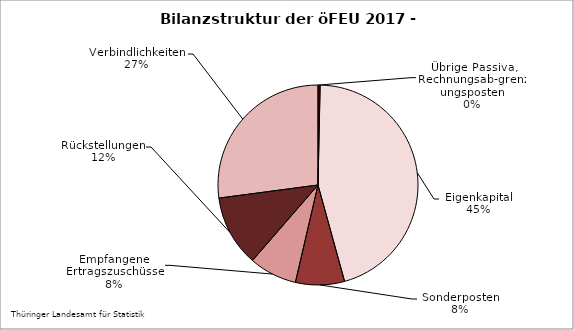
| Category | Series 0 |
|---|---|
| Übrige Passiva, Rechnungsab-grenzungsposten | 0.34 |
| Eigenkapital | 45.374 |
| SoPo mit Rücklageanteil, aus Zuwendungen und anderweitig nicht genannt | 7.915 |
| Empfangene Ertragszuschüsse | 7.746 |
| Rückstellungen | 11.528 |
| Verbindlichkeiten | 27.096 |